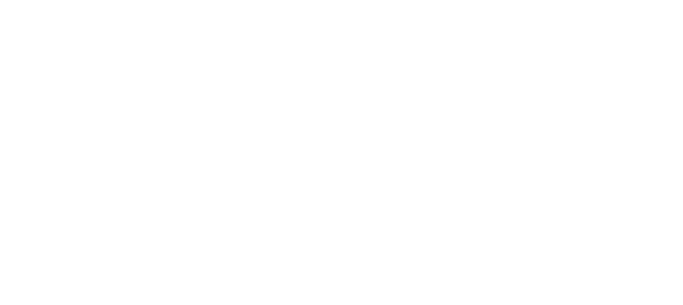
| Category | Series 0 |
|---|---|
| Águia | 0 |
| Gato | 0 |
| Tubarão | 0 |
| Lobo | 0 |